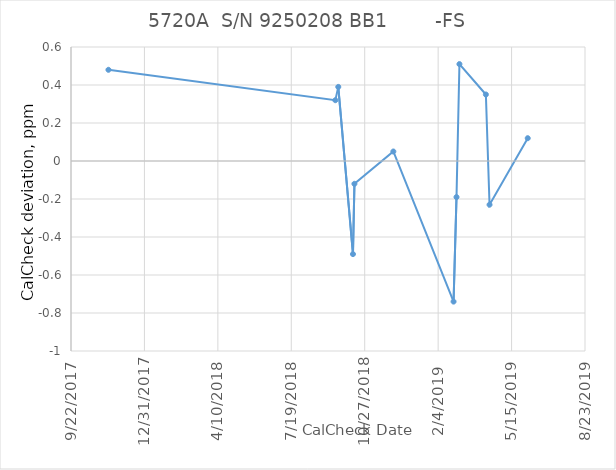
| Category |        -FS |
|---|---|
| 43051.0 | 0.48 |
| 43360.0 | 0.32 |
| 43364.0 | 0.39 |
| 43384.0 | -0.49 |
| 43386.0 | -0.12 |
| 43439.0 | 0.05 |
| 43521.0 | -0.74 |
| 43525.0 | -0.19 |
| 43529.0 | 0.51 |
| 43565.0 | 0.35 |
| 43570.0 | -0.23 |
| 43622.0 | 0.12 |